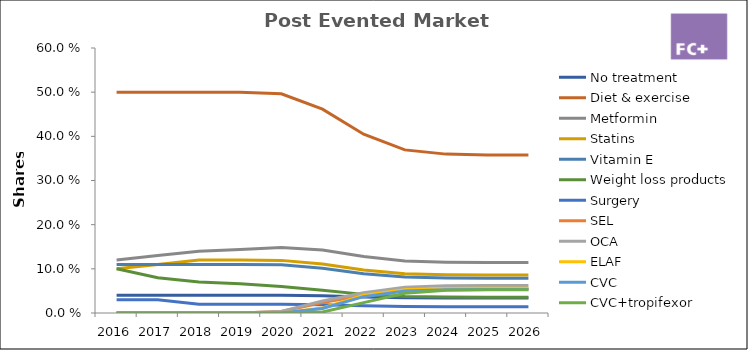
| Category | No treatment | Diet & exercise | Metformin | Statins | Vitamin E | Weight loss products | Surgery | SEL | OCA | ELAF | CVC | CVC+tropifexor |
|---|---|---|---|---|---|---|---|---|---|---|---|---|
| 2016.0 | 0.04 | 0.5 | 0.12 | 0.1 | 0.11 | 0.1 | 0.03 | 0 | 0 | 0 | 0 | 0 |
| 2017.0 | 0.04 | 0.5 | 0.13 | 0.11 | 0.11 | 0.08 | 0.03 | 0 | 0 | 0 | 0 | 0 |
| 2018.0 | 0.04 | 0.5 | 0.14 | 0.12 | 0.11 | 0.07 | 0.02 | 0 | 0 | 0 | 0 | 0 |
| 2019.0 | 0.04 | 0.5 | 0.144 | 0.12 | 0.11 | 0.066 | 0.02 | 0 | 0 | 0 | 0 | 0 |
| 2020.0 | 0.04 | 0.496 | 0.148 | 0.119 | 0.109 | 0.06 | 0.02 | 0.003 | 0.004 | 0 | 0 | 0 |
| 2021.0 | 0.039 | 0.462 | 0.142 | 0.111 | 0.102 | 0.051 | 0.018 | 0.024 | 0.027 | 0.011 | 0.01 | 0.002 |
| 2022.0 | 0.036 | 0.405 | 0.128 | 0.097 | 0.089 | 0.042 | 0.016 | 0.04 | 0.046 | 0.04 | 0.037 | 0.023 |
| 2023.0 | 0.035 | 0.369 | 0.118 | 0.089 | 0.081 | 0.037 | 0.015 | 0.051 | 0.058 | 0.053 | 0.05 | 0.044 |
| 2024.0 | 0.034 | 0.36 | 0.115 | 0.086 | 0.079 | 0.036 | 0.014 | 0.054 | 0.062 | 0.055 | 0.052 | 0.052 |
| 2025.0 | 0.034 | 0.358 | 0.115 | 0.086 | 0.079 | 0.036 | 0.014 | 0.055 | 0.062 | 0.056 | 0.053 | 0.053 |
| 2026.0 | 0.034 | 0.358 | 0.115 | 0.086 | 0.079 | 0.036 | 0.014 | 0.055 | 0.062 | 0.056 | 0.053 | 0.053 |